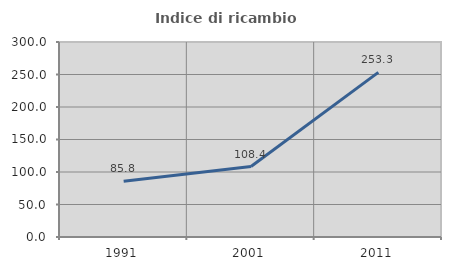
| Category | Indice di ricambio occupazionale  |
|---|---|
| 1991.0 | 85.792 |
| 2001.0 | 108.442 |
| 2011.0 | 253.261 |